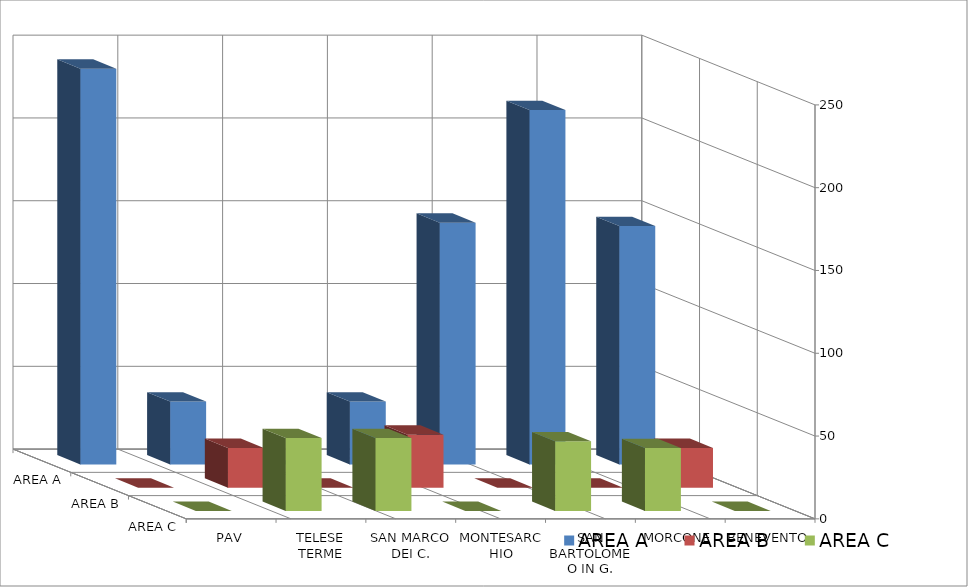
| Category | AREA A | AREA B | AREA C |
|---|---|---|---|
| BENEVENTO | 144 | 24 | 0 |
| MORCONE | 214 | 0 | 38 |
| SAN BARTOLOMEO IN G. | 146 | 0 | 42 |
| MONTESARCHIO | 38 | 32 | 0 |
| SAN MARCO DEI C. | 0 | 0 | 44 |
| TELESE TERME | 38 | 24 | 44 |
| PAV | 239 | 0 | 0 |